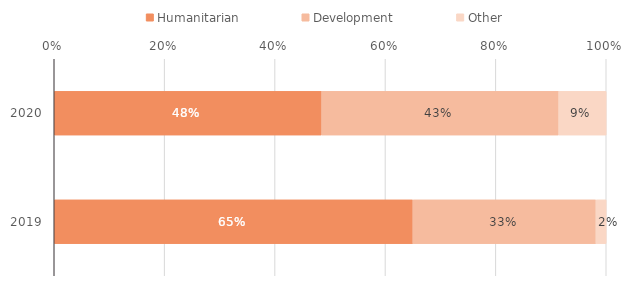
| Category | Humanitarian | Development | Other |
|---|---|---|---|
| 2019.0 | 0.65 | 0.332 | 0.019 |
| 2020.0 | 0.484 | 0.429 | 0.086 |